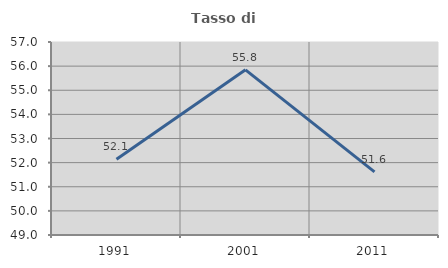
| Category | Tasso di occupazione   |
|---|---|
| 1991.0 | 52.137 |
| 2001.0 | 55.847 |
| 2011.0 | 51.618 |